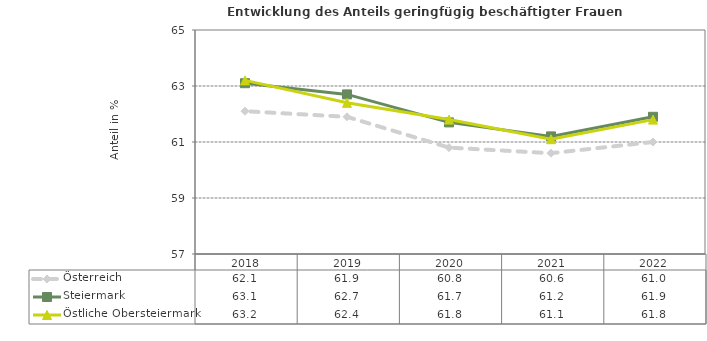
| Category | Österreich | Steiermark | Östliche Obersteiermark |
|---|---|---|---|
| 2022.0 | 61 | 61.9 | 61.8 |
| 2021.0 | 60.6 | 61.2 | 61.1 |
| 2020.0 | 60.8 | 61.7 | 61.8 |
| 2019.0 | 61.9 | 62.7 | 62.4 |
| 2018.0 | 62.1 | 63.1 | 63.2 |